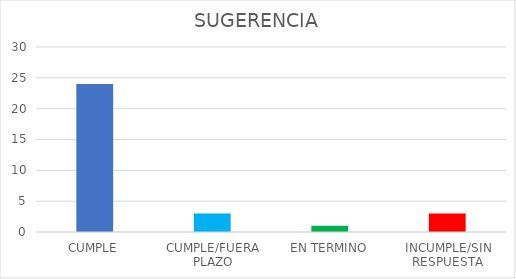
| Category | TOTAL |
|---|---|
| CUMPLE | 24 |
| CUMPLE/FUERA PLAZO | 3 |
| EN TERMINO | 1 |
| INCUMPLE/SIN RESPUESTA | 3 |